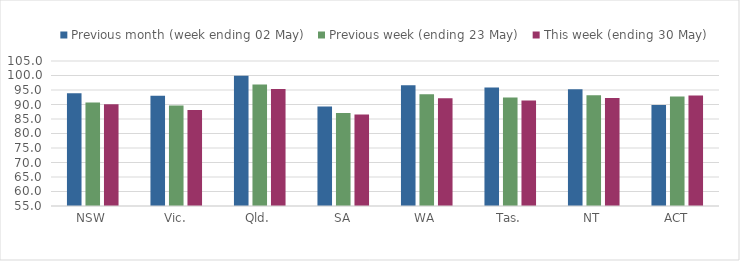
| Category | Previous month (week ending 02 May) | Previous week (ending 23 May) | This week (ending 30 May) |
|---|---|---|---|
| NSW | 93.864 | 90.674 | 90.073 |
| Vic. | 92.994 | 89.685 | 88.135 |
| Qld. | 99.951 | 96.899 | 95.308 |
| SA | 89.351 | 87.09 | 86.562 |
| WA | 96.68 | 93.569 | 92.124 |
| Tas. | 95.875 | 92.414 | 91.366 |
| NT | 95.254 | 93.22 | 92.203 |
| ACT | 89.855 | 92.754 | 93.13 |